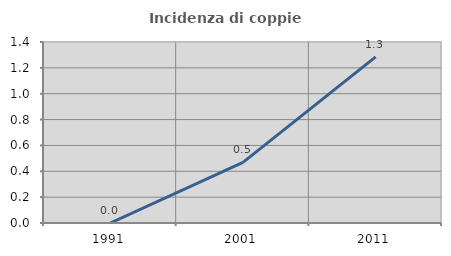
| Category | Incidenza di coppie miste |
|---|---|
| 1991.0 | 0 |
| 2001.0 | 0.469 |
| 2011.0 | 1.285 |